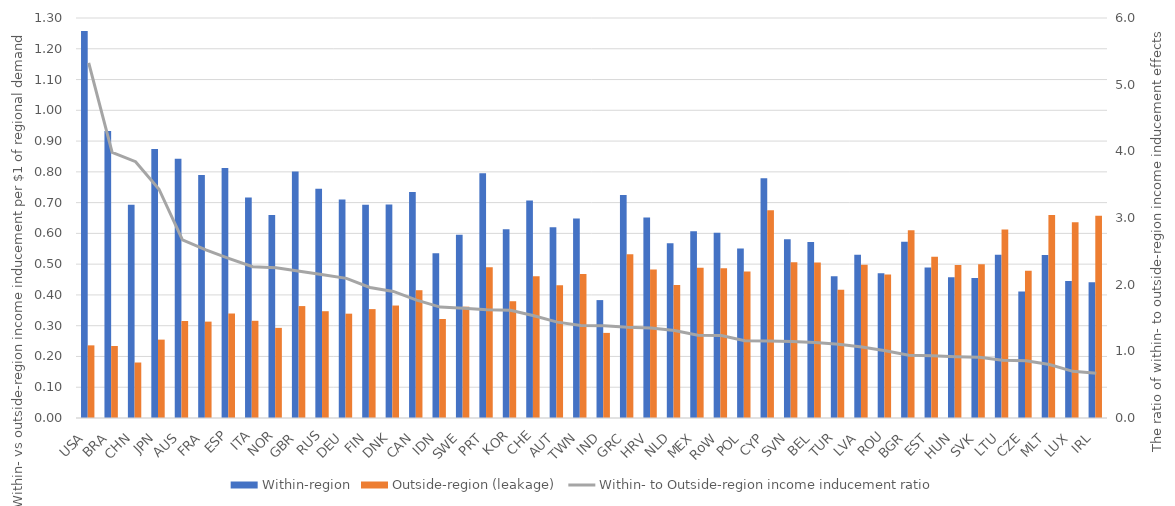
| Category | Within-region | Outside-region (leakage) |
|---|---|---|
| USA | 1.258 | 0.236 |
| BRA | 0.933 | 0.234 |
| CHN | 0.693 | 0.18 |
| JPN | 0.874 | 0.255 |
| AUS | 0.843 | 0.315 |
| FRA | 0.79 | 0.313 |
| ESP | 0.812 | 0.34 |
| ITA | 0.717 | 0.316 |
| NOR | 0.66 | 0.293 |
| GBR | 0.801 | 0.364 |
| RUS | 0.745 | 0.347 |
| DEU | 0.71 | 0.339 |
| FIN | 0.693 | 0.354 |
| DNK | 0.694 | 0.366 |
| CAN | 0.734 | 0.415 |
| IDN | 0.535 | 0.322 |
| SWE | 0.595 | 0.362 |
| PRT | 0.796 | 0.49 |
| KOR | 0.613 | 0.38 |
| CHE | 0.707 | 0.461 |
| AUT | 0.62 | 0.431 |
| TWN | 0.649 | 0.468 |
| IND | 0.383 | 0.277 |
| GRC | 0.725 | 0.532 |
| HRV | 0.651 | 0.482 |
| NLD | 0.568 | 0.432 |
| MEX | 0.607 | 0.488 |
| RoW | 0.602 | 0.487 |
| POL | 0.551 | 0.476 |
| CYP | 0.779 | 0.675 |
| SVN | 0.581 | 0.506 |
| BEL | 0.572 | 0.505 |
| TUR | 0.461 | 0.417 |
| LVA | 0.531 | 0.498 |
| ROU | 0.471 | 0.466 |
| BGR | 0.573 | 0.61 |
| EST | 0.489 | 0.524 |
| HUN | 0.458 | 0.497 |
| SVK | 0.455 | 0.5 |
| LTU | 0.53 | 0.613 |
| CZE | 0.411 | 0.479 |
| MLT | 0.53 | 0.66 |
| LUX | 0.445 | 0.636 |
| IRL | 0.441 | 0.658 |